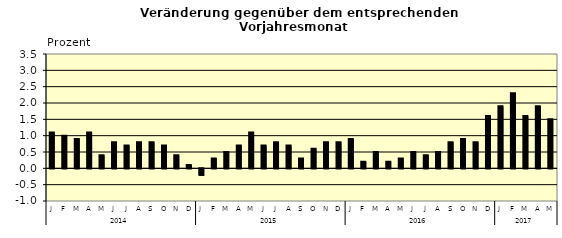
| Category | Series 0 |
|---|---|
| 0 | 1.1 |
| 1 | 1 |
| 2 | 0.9 |
| 3 | 1.1 |
| 4 | 0.4 |
| 5 | 0.8 |
| 6 | 0.7 |
| 7 | 0.8 |
| 8 | 0.8 |
| 9 | 0.7 |
| 10 | 0.4 |
| 11 | 0.1 |
| 12 | -0.2 |
| 13 | 0.3 |
| 14 | 0.5 |
| 15 | 0.7 |
| 16 | 1.1 |
| 17 | 0.7 |
| 18 | 0.8 |
| 19 | 0.7 |
| 20 | 0.3 |
| 21 | 0.6 |
| 22 | 0.8 |
| 23 | 0.8 |
| 24 | 0.9 |
| 25 | 0.2 |
| 26 | 0.5 |
| 27 | 0.2 |
| 28 | 0.3 |
| 29 | 0.5 |
| 30 | 0.4 |
| 31 | 0.5 |
| 32 | 0.8 |
| 33 | 0.9 |
| 34 | 0.8 |
| 35 | 1.6 |
| 36 | 1.9 |
| 37 | 2.3 |
| 38 | 1.6 |
| 39 | 1.9 |
| 40 | 1.5 |